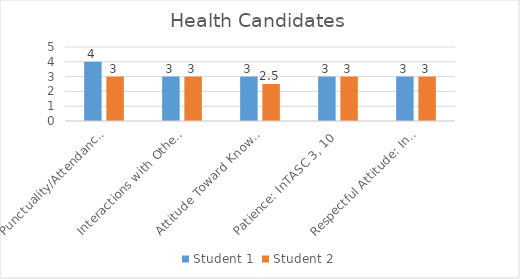
| Category | Student 1 | Student 2 |
|---|---|---|
| Punctuality/Attendance: InTASC 1, 9 | 4 | 3 |
| Interactions with Others: InTASC 3, 7, 10 | 3 | 3 |
| Attitude Toward Knowledge and Learning: InTASC 1, 4, 5, 9, 10 | 3 | 2.5 |
| Patience: InTASC 3, 10 | 3 | 3 |
| Respectful Attitude: InTASC 3, 7, 10 | 3 | 3 |